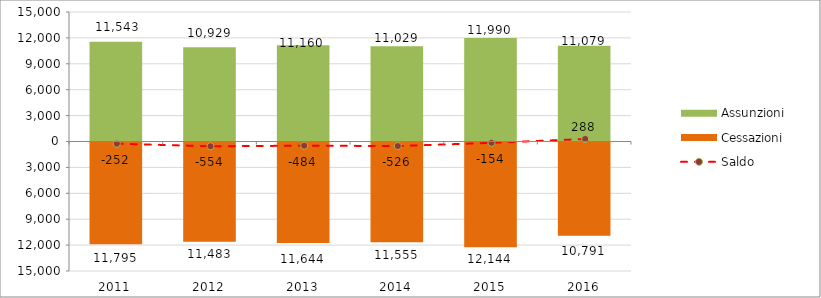
| Category | Assunzioni | Cessazioni |
|---|---|---|
| 2011.0 | 11543 | -11795 |
| 2012.0 | 10929 | -11483 |
| 2013.0 | 11160 | -11644 |
| 2014.0 | 11029 | -11555 |
| 2015.0 | 11990 | -12144 |
| 2016.0 | 11079 | -10791 |